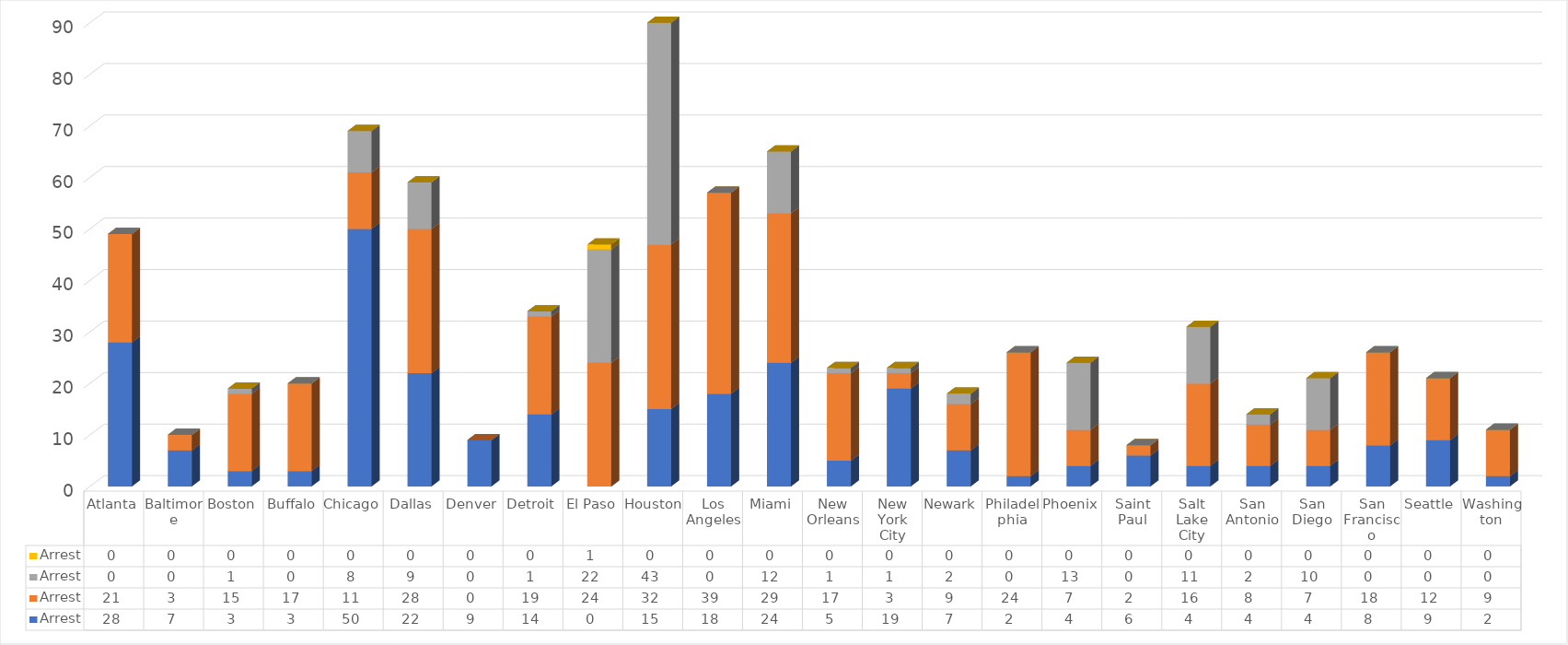
| Category | Sum of Other Priority - Arrest | Sum of Public Safety - Arrest | Sum of Border Security - Arrest | Sum of National Security - Arrest |
|---|---|---|---|---|
| Atlanta | 28 | 21 | 0 | 0 |
| Baltimore | 7 | 3 | 0 | 0 |
| Boston | 3 | 15 | 1 | 0 |
| Buffalo | 3 | 17 | 0 | 0 |
| Chicago | 50 | 11 | 8 | 0 |
| Dallas | 22 | 28 | 9 | 0 |
| Denver | 9 | 0 | 0 | 0 |
| Detroit | 14 | 19 | 1 | 0 |
| El Paso | 0 | 24 | 22 | 1 |
| Houston | 15 | 32 | 43 | 0 |
| Los Angeles | 18 | 39 | 0 | 0 |
| Miami | 24 | 29 | 12 | 0 |
| New Orleans | 5 | 17 | 1 | 0 |
| New York City | 19 | 3 | 1 | 0 |
| Newark | 7 | 9 | 2 | 0 |
| Philadelphia | 2 | 24 | 0 | 0 |
| Phoenix | 4 | 7 | 13 | 0 |
| Saint Paul | 6 | 2 | 0 | 0 |
| Salt Lake City | 4 | 16 | 11 | 0 |
| San Antonio | 4 | 8 | 2 | 0 |
| San Diego | 4 | 7 | 10 | 0 |
| San Francisco | 8 | 18 | 0 | 0 |
| Seattle | 9 | 12 | 0 | 0 |
| Washington | 2 | 9 | 0 | 0 |